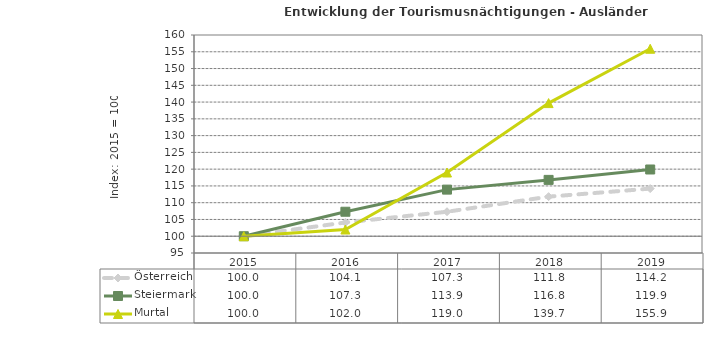
| Category | Österreich | Steiermark | Murtal |
|---|---|---|---|
| 2019.0 | 114.2 | 119.9 | 155.9 |
| 2018.0 | 111.8 | 116.8 | 139.7 |
| 2017.0 | 107.3 | 113.9 | 119 |
| 2016.0 | 104.1 | 107.3 | 102 |
| 2015.0 | 100 | 100 | 100 |